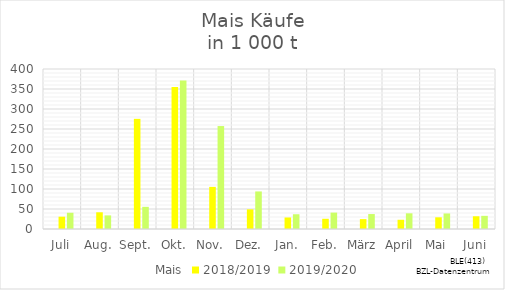
| Category | Mais | 2018/2019 | 2019/2020 |
|---|---|---|---|
| Juli |  | 30.792 | 40.624 |
| Aug. |  | 41.781 | 34.045 |
| Sept. |  | 275.373 | 55.418 |
| Okt. |  | 354.976 | 371.554 |
| Nov. |  | 105.313 | 257.369 |
| Dez. |  | 49.167 | 93.902 |
| Jan. |  | 28.809 | 36.873 |
| Feb. |  | 25.558 | 40.985 |
| März |  | 24.702 | 37.368 |
| April |  | 23.054 | 39.205 |
| Mai |  | 29.219 | 38.835 |
| Juni |  | 31.854 | 32.907 |